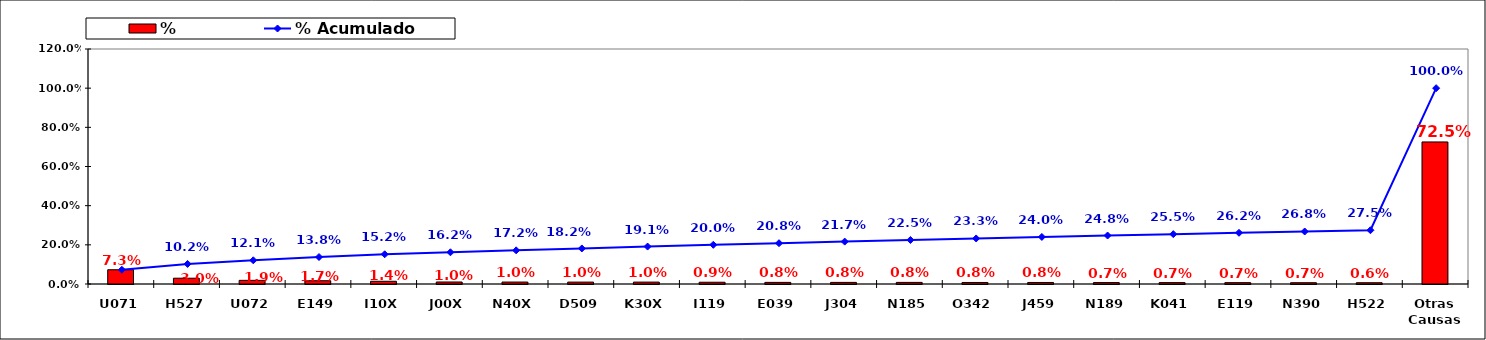
| Category | % |
|---|---|
| U071 | 0.073 |
| H527 | 0.03 |
| U072 | 0.019 |
| E149 | 0.017 |
| I10X | 0.014 |
| J00X | 0.01 |
| N40X | 0.01 |
| D509 | 0.01 |
| K30X | 0.01 |
| I119 | 0.009 |
| E039 | 0.008 |
| J304 | 0.008 |
| N185 | 0.008 |
| O342 | 0.008 |
| J459 | 0.008 |
| N189 | 0.007 |
| K041 | 0.007 |
| E119 | 0.007 |
| N390 | 0.007 |
| H522 | 0.006 |
| Otras Causas | 0.725 |